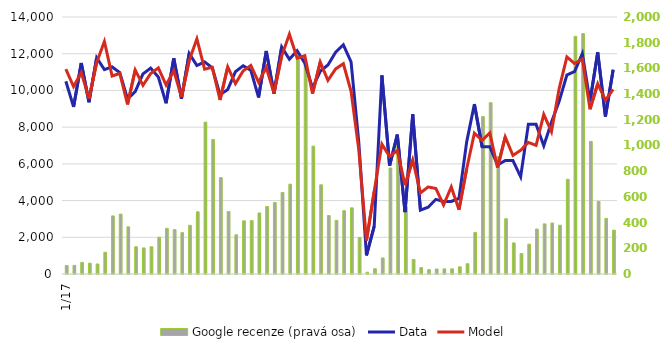
| Category | Google recenze (pravá osa) |
|---|---|
| 2017-01-01 | 66 |
| 2017-02-01 | 67 |
| 2017-03-01 | 90 |
| 2017-04-01 | 84 |
| 2017-05-01 | 78 |
| 2017-06-01 | 169 |
| 2017-07-01 | 452 |
| 2017-08-01 | 466 |
| 2017-09-01 | 367 |
| 2017-10-01 | 212 |
| 2017-11-01 | 203 |
| 2017-12-01 | 212 |
| 2018-01-01 | 286 |
| 2018-02-01 | 355 |
| 2018-03-01 | 345 |
| 2018-04-01 | 322 |
| 2018-05-01 | 379 |
| 2018-06-01 | 484 |
| 2018-07-01 | 1182 |
| 2018-08-01 | 1047 |
| 2018-09-01 | 750 |
| 2018-10-01 | 486 |
| 2018-11-01 | 305 |
| 2018-12-01 | 414 |
| 2019-01-01 | 416 |
| 2019-02-01 | 475 |
| 2019-03-01 | 525 |
| 2019-04-01 | 556 |
| 2019-05-01 | 634 |
| 2019-06-01 | 699 |
| 2019-07-01 | 1689 |
| 2019-08-01 | 1631 |
| 2019-09-01 | 995 |
| 2019-10-01 | 694 |
| 2019-11-01 | 455 |
| 2019-12-01 | 417 |
| 2020-01-01 | 493 |
| 2020-02-01 | 515 |
| 2020-03-01 | 284 |
| 2020-04-01 | 14 |
| 2020-05-01 | 41 |
| 2020-06-01 | 125 |
| 2020-07-01 | 825 |
| 2020-08-01 | 1017 |
| 2020-09-01 | 527 |
| 2020-10-01 | 113 |
| 2020-11-01 | 50 |
| 2020-12-01 | 34 |
| 2021-01-01 | 39 |
| 2021-02-01 | 40 |
| 2021-03-01 | 40 |
| 2021-04-01 | 56 |
| 2021-05-01 | 80 |
| 2021-06-01 | 324 |
| 2021-07-01 | 1225 |
| 2021-08-01 | 1333 |
| 2021-09-01 | 915 |
| 2021-10-01 | 430 |
| 2021-11-01 | 242 |
| 2021-12-01 | 159 |
| 2022-01-01 | 232 |
| 2022-02-01 | 350 |
| 2022-03-01 | 390 |
| 2022-04-01 | 397 |
| 2022-05-01 | 380 |
| 2022-06-01 | 737 |
| 2022-07-01 | 1849 |
| 2022-08-01 | 1871 |
| 2022-09-01 | 1032 |
| 2022-10-01 | 565 |
| 2022-11-01 | 433 |
| 2022-12-01 | 341 |